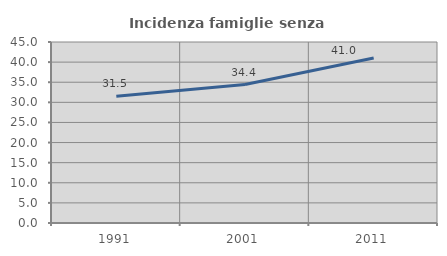
| Category | Incidenza famiglie senza nuclei |
|---|---|
| 1991.0 | 31.496 |
| 2001.0 | 34.426 |
| 2011.0 | 41.045 |